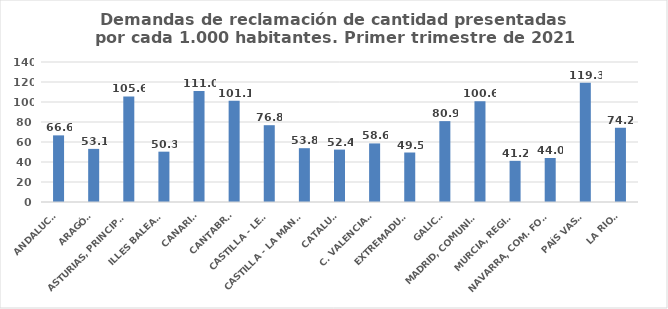
| Category | 616 |
|---|---|
| ANDALUCÍA | 66.625 |
| ARAGÓN | 53.117 |
| ASTURIAS, PRINCIPADO | 105.58 |
| ILLES BALEARS | 50.327 |
| CANARIAS | 111.036 |
| CANTABRIA | 101.145 |
| CASTILLA - LEÓN | 76.807 |
| CASTILLA - LA MANCHA | 53.814 |
| CATALUÑA | 52.405 |
| C. VALENCIANA | 58.581 |
| EXTREMADURA | 49.492 |
| GALICIA | 80.876 |
| MADRID, COMUNIDAD | 100.644 |
| MURCIA, REGIÓN | 41.174 |
| NAVARRA, COM. FORAL | 44.023 |
| PAÍS VASCO | 119.319 |
| LA RIOJA | 74.243 |